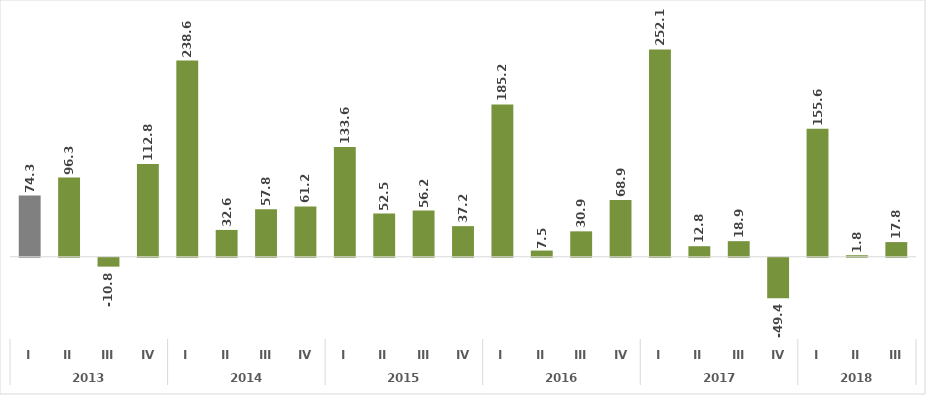
| Category | Series 0 |
|---|---|
| 0 | 74.318 |
| 1 | 96.29 |
| 2 | -10.797 |
| 3 | 112.807 |
| 4 | 238.59 |
| 5 | 32.609 |
| 6 | 57.787 |
| 7 | 61.16 |
| 8 | 133.586 |
| 9 | 52.525 |
| 10 | 56.185 |
| 11 | 37.228 |
| 12 | 185.163 |
| 13 | 7.524 |
| 14 | 30.891 |
| 15 | 68.917 |
| 16 | 252.056 |
| 17 | 12.826 |
| 18 | 18.941 |
| 19 | -49.363 |
| 20 | 155.583 |
| 21 | 1.842 |
| 22 | 17.815 |